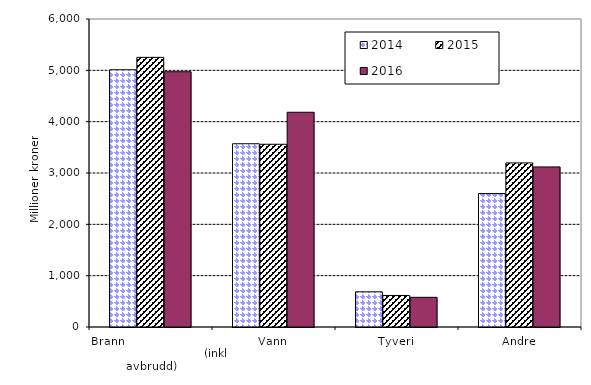
| Category | 2014 | 2015 | 2016 |
|---|---|---|---|
| Brann                                                       (inkl avbrudd) | 5010.408 | 5253.019 | 4973.264 |
| Vann | 3569.905 | 3559.668 | 4183.152 |
| Tyveri | 684.937 | 613.944 | 578.224 |
| Andre | 2599.653 | 3196.442 | 3118.369 |